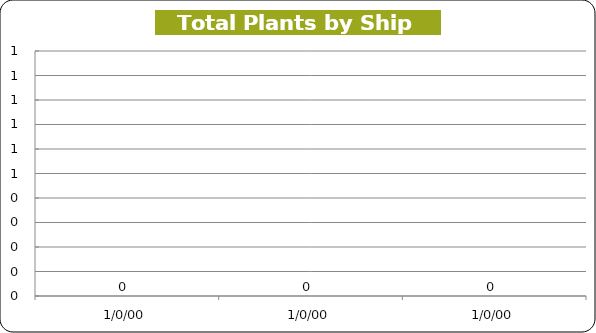
| Category | Ship Week |
|---|---|
| 1/0/1900 | 0 |
| 1/0/1900 | 0 |
| 1/0/1900 | 0 |